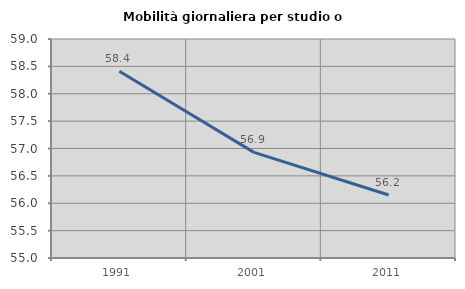
| Category | Mobilità giornaliera per studio o lavoro |
|---|---|
| 1991.0 | 58.413 |
| 2001.0 | 56.93 |
| 2011.0 | 56.151 |